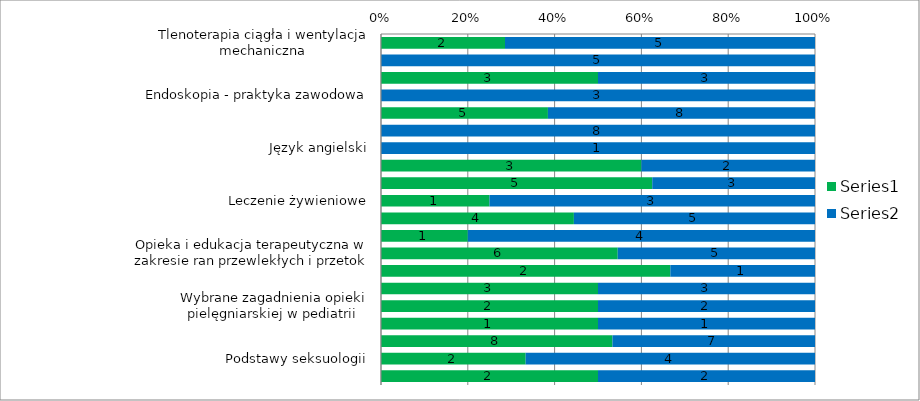
| Category | Series 0 | Series 1 |
|---|---|---|
| Tlenoterapia ciągła i wentylacja mechaniczna | 2 | 5 |
| Tlenoterapia ciągła i wentylacja mechaniczna - praktyka zawodowa | 0 | 5 |
| Endoskopia | 3 | 3 |
| Endoskopia - praktyka zawodowa | 0 | 3 |
| Poradnictwo w pielęgniarstwie | 5 | 8 |
| Poradnictwo w pielęgniarstwie - praktyka zawodowa | 0 | 8 |
| Język angielski | 0 | 1 |
| Dydaktyka medyczna | 3 | 2 |
| Koordynowana opieka zdrowotna | 5 | 3 |
| Leczenie żywieniowe | 1 | 3 |
| Promocja zdrowia i świadczenia profilaktycze | 4 | 5 |
| Opieka i edukacja terapeutyczna w chorobach przewlekłych (leczenie p.bólowe) | 1 | 4 |
| Opieka i edukacja terapeutyczna w zakresie ran przewlekłych i przetok | 6 | 5 |
| Opieka i edukacja terapeutyczna w transplantologii | 2 | 1 |
| Badania naukowe w pielęgniarstwie  | 3 | 3 |
| Wybrane zagadnienia opieki pielęgniarskiej w pediatrii  | 2 | 2 |
| Zajęcia fakultatywne  | 1 | 1 |
| Pielęgniarstwo operacyjne | 8 | 7 |
| Podstawy seksuologii | 2 | 4 |
| Komunikacja z trudnym pacjentem  | 2 | 2 |